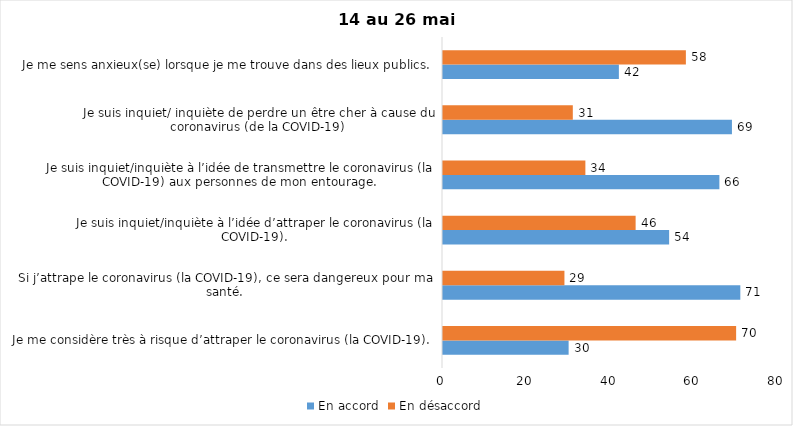
| Category | En accord | En désaccord |
|---|---|---|
| Je me considère très à risque d’attraper le coronavirus (la COVID-19). | 30 | 70 |
| Si j’attrape le coronavirus (la COVID-19), ce sera dangereux pour ma santé. | 71 | 29 |
| Je suis inquiet/inquiète à l’idée d’attraper le coronavirus (la COVID-19). | 54 | 46 |
| Je suis inquiet/inquiète à l’idée de transmettre le coronavirus (la COVID-19) aux personnes de mon entourage. | 66 | 34 |
| Je suis inquiet/ inquiète de perdre un être cher à cause du coronavirus (de la COVID-19) | 69 | 31 |
| Je me sens anxieux(se) lorsque je me trouve dans des lieux publics. | 42 | 58 |